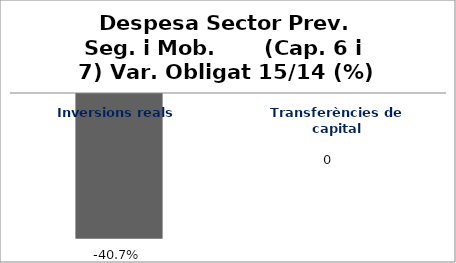
| Category | Series 0 |
|---|---|
| Inversions reals | -0.407 |
| Transferències de capital | 0 |